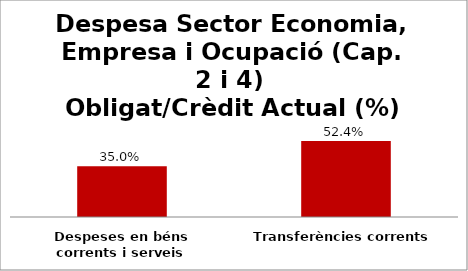
| Category | Series 0 |
|---|---|
| Despeses en béns corrents i serveis | 0.35 |
| Transferències corrents | 0.524 |